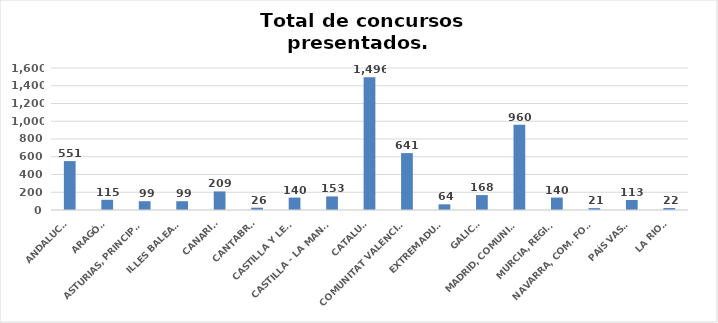
| Category | Series 0 |
|---|---|
| ANDALUCÍA | 551 |
| ARAGÓN | 115 |
| ASTURIAS, PRINCIPADO | 99 |
| ILLES BALEARS | 99 |
| CANARIAS | 209 |
| CANTABRIA | 26 |
| CASTILLA Y LEÓN | 140 |
| CASTILLA - LA MANCHA | 153 |
| CATALUÑA | 1496 |
| COMUNITAT VALENCIANA | 641 |
| EXTREMADURA | 64 |
| GALICIA | 168 |
| MADRID, COMUNIDAD | 960 |
| MURCIA, REGIÓN | 140 |
| NAVARRA, COM. FORAL | 21 |
| PAÍS VASCO | 113 |
| LA RIOJA | 22 |